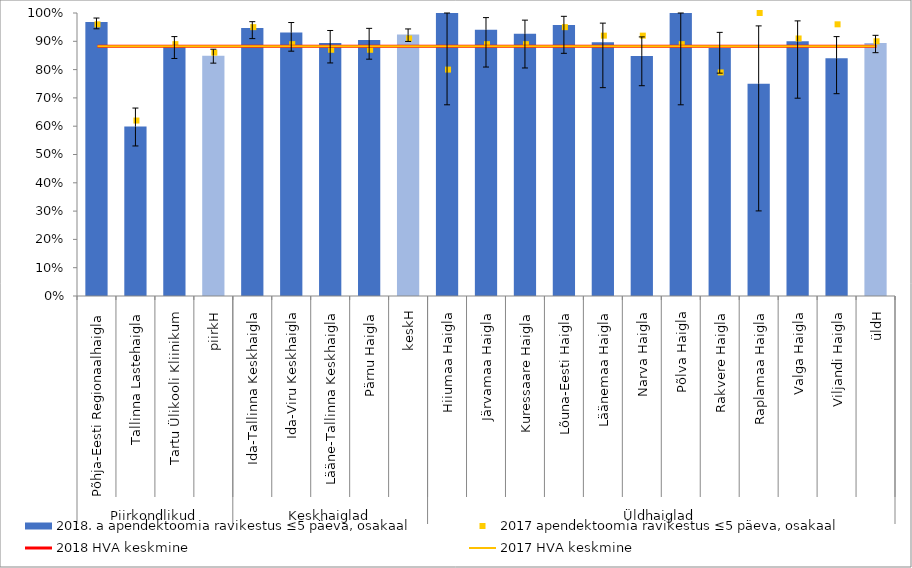
| Category | 2018. a apendektoomia ravikestus ≤5 päeva, osakaal |
|---|---|
| 0 | 0.968 |
| 1 | 0.599 |
| 2 | 0.883 |
| 3 | 0.849 |
| 4 | 0.947 |
| 5 | 0.931 |
| 6 | 0.894 |
| 7 | 0.904 |
| 8 | 0.924 |
| 9 | 1 |
| 10 | 0.941 |
| 11 | 0.927 |
| 12 | 0.957 |
| 13 | 0.897 |
| 14 | 0.848 |
| 15 | 1 |
| 16 | 0.877 |
| 17 | 0.75 |
| 18 | 0.9 |
| 19 | 0.84 |
| 20 | 0.894 |